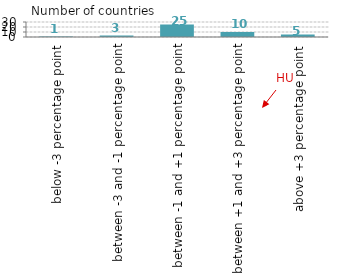
| Category | Országok száma |
|---|---|
| below -3 percentage point | 1 |
| between -3 and -1 percentage point | 3 |
| between -1 and +1 percentage point | 25 |
| between +1 and +3 percentage point | 10 |
| above +3 percentage point | 5 |